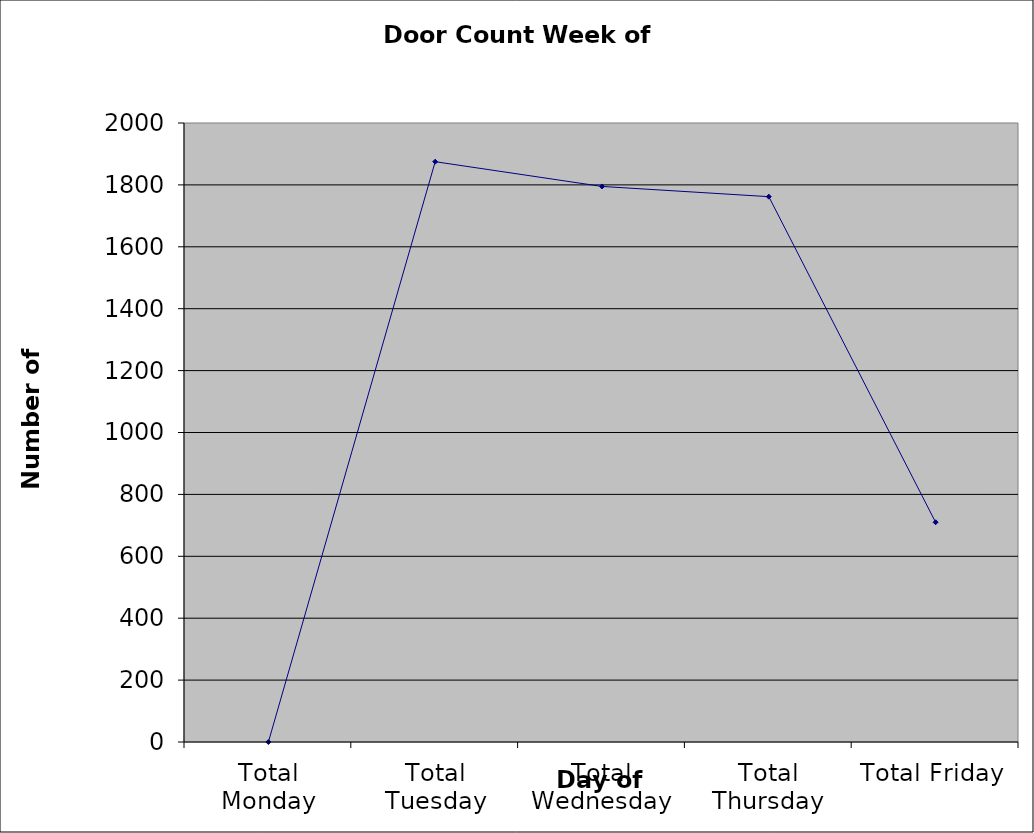
| Category | Series 0 |
|---|---|
| Total Monday | 0 |
| Total Tuesday | 1875 |
| Total Wednesday | 1795 |
| Total Thursday | 1762 |
| Total Friday | 710 |